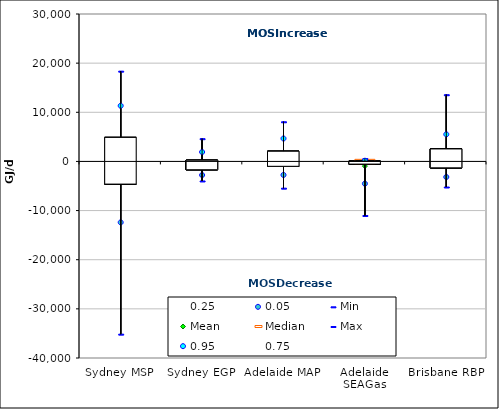
| Category | 0.25 | 0.05 | Min | Mean | Median | Max | 0.95 | 0.75 |
|---|---|---|---|---|---|---|---|---|
| Sydney MSP | -4611.5 | -12400.3 | -35148 | -399.167 | 510 | 18367 | 11325.8 | 4891.25 |
| Sydney EGP | -1691.038 | -2771.792 | -3973.468 | -661.134 | -846.243 | 4625.392 | 1916.484 | 243.664 |
| Adelaide MAP | -992.25 | -2748.6 | -5440 | 638.967 | 447 | 8070 | 4667.35 | 2072.5 |
| Adelaide SEAGas | -542.25 | -4521.05 | -11001 | -949.6 | 18 | 584 | 140.65 | 61.25 |
| Brisbane RBP | -1305.25 | -3169.15 | -5206 | 862.1 | 457.5 | 13575 | 5512.75 | 2535.75 |